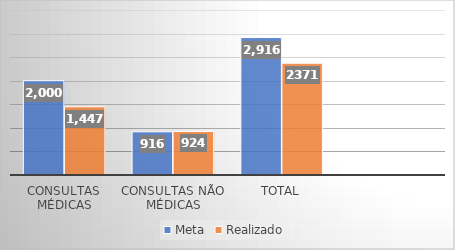
| Category | Meta | Realizado |
|---|---|---|
| Consultas Médicas | 2000 | 1447 |
| Consultas não médicas | 916 | 924 |
| Total | 2916 | 2371 |